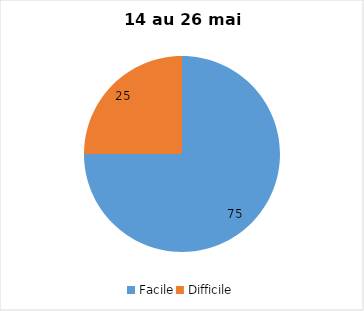
| Category | Series 0 |
|---|---|
| Facile | 75 |
| Difficile | 25 |